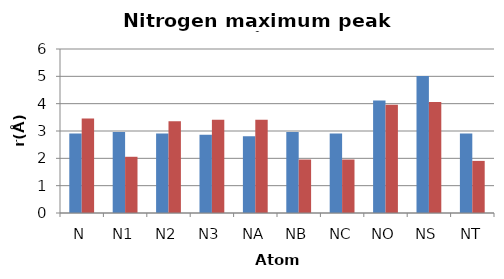
| Category | OW | HW |
|---|---|---|
| N | 2.91 | 3.462 |
| N1 | 2.96 | 2.057 |
| N2 | 2.91 | 3.361 |
| N3 | 2.86 | 3.411 |
| NA | 2.809 | 3.411 |
| NB | 2.96 | 1.956 |
| NC | 2.91 | 1.956 |
| NO | 4.114 | 3.963 |
| NS | 5.017 | 4.064 |
| NT | 2.91 | 1.906 |